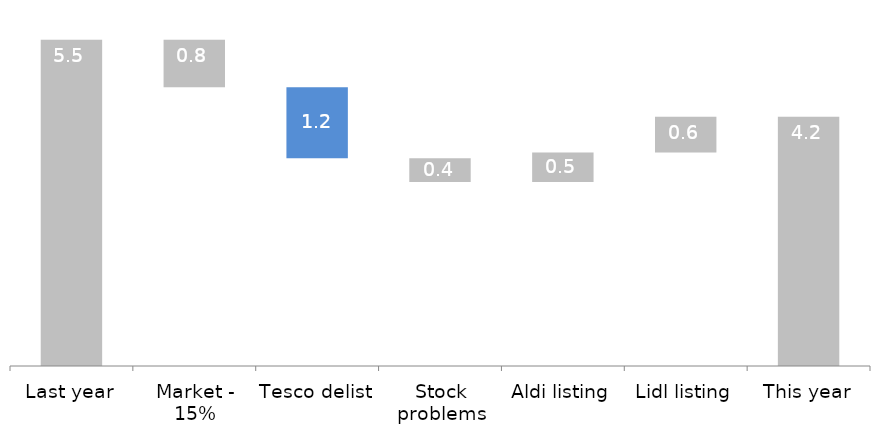
| Category | Hidden bars | Bars you see |
|---|---|---|
| Last year | 0 | 5.5 |
| Market - 15% | 4.7 | 0.8 |
| Tesco delist | 3.5 | 1.2 |
| Stock problems | 3.1 | 0.4 |
| Aldi listing | 3.1 | 0.5 |
| Lidl listing | 3.6 | 0.6 |
| This year | 0 | 4.2 |